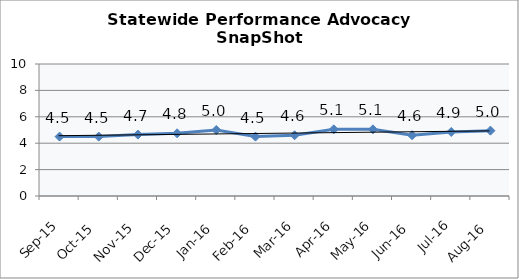
| Category | Statewide |
|---|---|
| Sep-15 | 4.5 |
| Oct-15 | 4.5 |
| Nov-15 | 4.65 |
| Dec-15 | 4.75 |
| Jan-16 | 5 |
| Feb-16 | 4.5 |
| Mar-16 | 4.6 |
| Apr-16 | 5.05 |
| May-16 | 5.05 |
| Jun-16 | 4.6 |
| Jul-16 | 4.85 |
| Aug-16 | 4.95 |